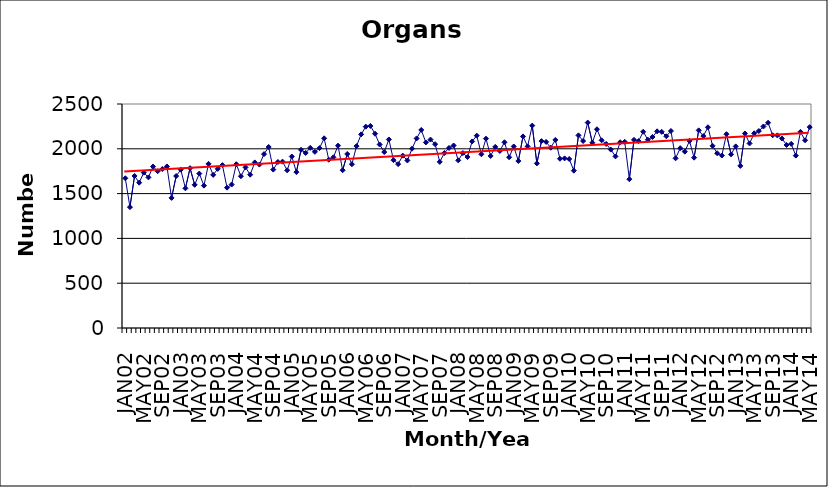
| Category | Series 0 |
|---|---|
| JAN02 | 1671 |
| FEB02 | 1349 |
| MAR02 | 1697 |
| APR02 | 1622 |
| MAY02 | 1734 |
| JUN02 | 1681 |
| JUL02 | 1802 |
| AUG02 | 1750 |
| SEP02 | 1774 |
| OCT02 | 1803 |
| NOV02 | 1452 |
| DEC02 | 1696 |
| JAN03 | 1767 |
| FEB03 | 1559 |
| MAR03 | 1784 |
| APR03 | 1598 |
| MAY03 | 1723 |
| JUN03 | 1589 |
| JUL03 | 1832 |
| AUG03 | 1709 |
| SEP03 | 1776 |
| OCT03 | 1818 |
| NOV03 | 1566 |
| DEC03 | 1601 |
| JAN04 | 1828 |
| FEB04 | 1694 |
| MAR04 | 1793 |
| APR04 | 1711 |
| MAY04 | 1848 |
| JUN04 | 1824 |
| JUL04 | 1941 |
| AUG04 | 2020 |
| SEP04 | 1768 |
| OCT04 | 1853 |
| NOV04 | 1857 |
| DEC04 | 1760 |
| JAN05 | 1914 |
| FEB05 | 1740 |
| MAR05 | 1989 |
| APR05 | 1954 |
| MAY05 | 2011 |
| JUN05 | 1966 |
| JUL05 | 2008 |
| AUG05 | 2117 |
| SEP05 | 1878 |
| OCT05 | 1905 |
| NOV05 | 2035 |
| DEC05 | 1761 |
| JAN06 | 1942 |
| FEB06 | 1828 |
| MAR06 | 2030 |
| APR06 | 2161 |
| MAY06 | 2247 |
| JUN06 | 2255 |
| JUL06 | 2168 |
| AUG06 | 2048 |
| SEP06 | 1964 |
| OCT06 | 2104 |
| NOV06 | 1873 |
| DEC06 | 1829 |
| JAN07 | 1924 |
| FEB07 | 1870 |
| MAR07 | 2001 |
| APR07 | 2116 |
| MAY07 | 2210 |
| JUN07 | 2071 |
| JUL07 | 2103 |
| AUG07 | 2052 |
| SEP07 | 1854 |
| OCT07 | 1953 |
| NOV07 | 2009 |
| DEC07 | 2037 |
| JAN08 | 1871 |
| FEB08 | 1952 |
| MAR08 | 1908 |
| APR08 | 2082 |
| MAY08 | 2147 |
| JUN08 | 1939 |
| JUL08 | 2113 |
| AUG08 | 1920 |
| SEP08 | 2021 |
| OCT08 | 1976 |
| NOV08 | 2073 |
| DEC08 | 1906 |
| JAN09 | 2026 |
| FEB09 | 1864 |
| MAR09 | 2138 |
| APR09 | 2027 |
| MAY09 | 2259 |
| JUN09 | 1837 |
| JUL09 | 2086 |
| AUG09 | 2077 |
| SEP09 | 2012 |
| OCT09 | 2099 |
| NOV09 | 1889 |
| DEC09 | 1893 |
| JAN10 | 1886 |
| FEB10 | 1756 |
| MAR10 | 2150 |
| APR10 | 2087 |
| MAY10 | 2293 |
| JUN10 | 2068 |
| JUL10 | 2218 |
| AUG10 | 2095 |
| SEP10 | 2054 |
| OCT10 | 1991 |
| NOV10 | 1915 |
| DEC10 | 2073 |
| JAN11 | 2078 |
| FEB11 | 1661 |
| MAR11 | 2100 |
| APR11 | 2086 |
| MAY11 | 2190 |
| JUN11 | 2102 |
| JUL11 | 2132 |
| AUG11 | 2195 |
| SEP11 | 2189 |
| OCT11 | 2140 |
| NOV11 | 2199 |
| DEC11 | 1894 |
| JAN12 | 2007 |
| FEB12 | 1968 |
| MAR12 | 2088 |
| APR12 | 1901 |
| MAY12 | 2206 |
| JUN12 | 2142 |
| JUL12 | 2240 |
| AUG12 | 2033 |
| SEP12 | 1950 |
| OCT12 | 1925 |
| NOV12 | 2163 |
| DEC12 | 1938 |
| JAN13 | 2027 |
| FEB13 | 1809 |
| MAR13 | 2171 |
| APR13 | 2060 |
| MAY13 | 2173 |
| JUN13 | 2198 |
| JUL13 | 2249 |
| AUG13 | 2291 |
| SEP13 | 2151 |
| OCT13 | 2150 |
| NOV13 | 2115 |
| DEC13 | 2043 |
| JAN14 | 2055 |
| FEB14 | 1924 |
| MAR14 | 2189 |
| APR14 | 2095 |
| MAY14 | 2242 |